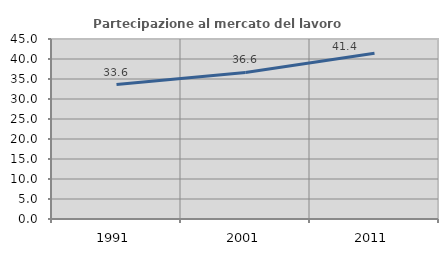
| Category | Partecipazione al mercato del lavoro  femminile |
|---|---|
| 1991.0 | 33.62 |
| 2001.0 | 36.628 |
| 2011.0 | 41.416 |